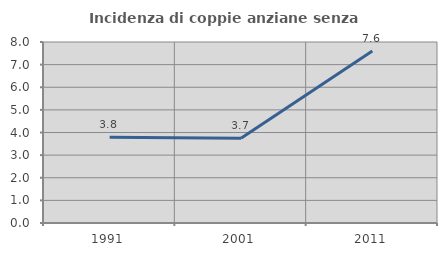
| Category | Incidenza di coppie anziane senza figli  |
|---|---|
| 1991.0 | 3.791 |
| 2001.0 | 3.747 |
| 2011.0 | 7.597 |